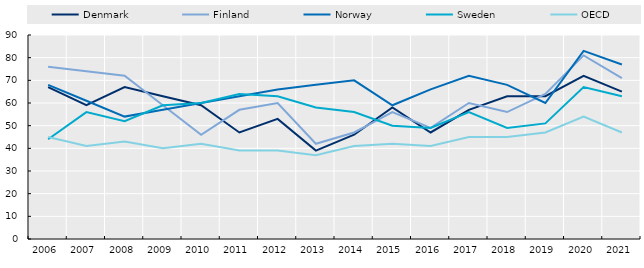
| Category | Denmark | Finland | Norway | Sweden | OECD |
|---|---|---|---|---|---|
| 2006.0 | 67 | 76 | 68 | 44 | 45 |
| 2007.0 | 59 | 74 | 61 | 56 | 41 |
| 2008.0 | 67 | 72 | 54 | 52 | 43 |
| 2009.0 | 63 | 59 | 57 | 59 | 40 |
| 2010.0 | 59 | 46 | 60 | 60 | 42 |
| 2011.0 | 47 | 57 | 63 | 64 | 39 |
| 2012.0 | 53 | 60 | 66 | 63 | 39 |
| 2013.0 | 39 | 42 | 68 | 58 | 37 |
| 2014.0 | 46 | 47 | 70 | 56 | 41 |
| 2015.0 | 58 | 56 | 59 | 50 | 42 |
| 2016.0 | 47 | 49 | 66 | 49 | 41 |
| 2017.0 | 57 | 60 | 72 | 56 | 45 |
| 2018.0 | 63 | 56 | 68 | 49 | 45 |
| 2019.0 | 63 | 64 | 60 | 51 | 47 |
| 2020.0 | 72 | 81 | 83 | 67 | 54 |
| 2021.0 | 65 | 71 | 77 | 63 | 47 |